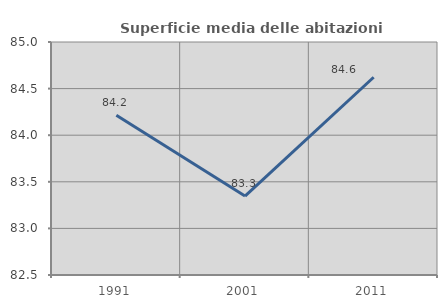
| Category | Superficie media delle abitazioni occupate |
|---|---|
| 1991.0 | 84.214 |
| 2001.0 | 83.347 |
| 2011.0 | 84.622 |